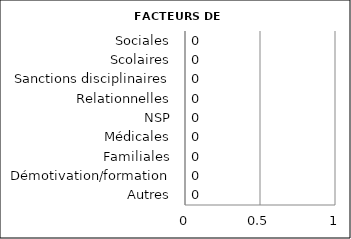
| Category | EFFECTIF |
|---|---|
| Autres | 0 |
| Démotivation/formation | 0 |
| Familiales | 0 |
| Médicales | 0 |
| NSP | 0 |
| Relationnelles | 0 |
| Sanctions disciplinaires | 0 |
| Scolaires | 0 |
| Sociales | 0 |